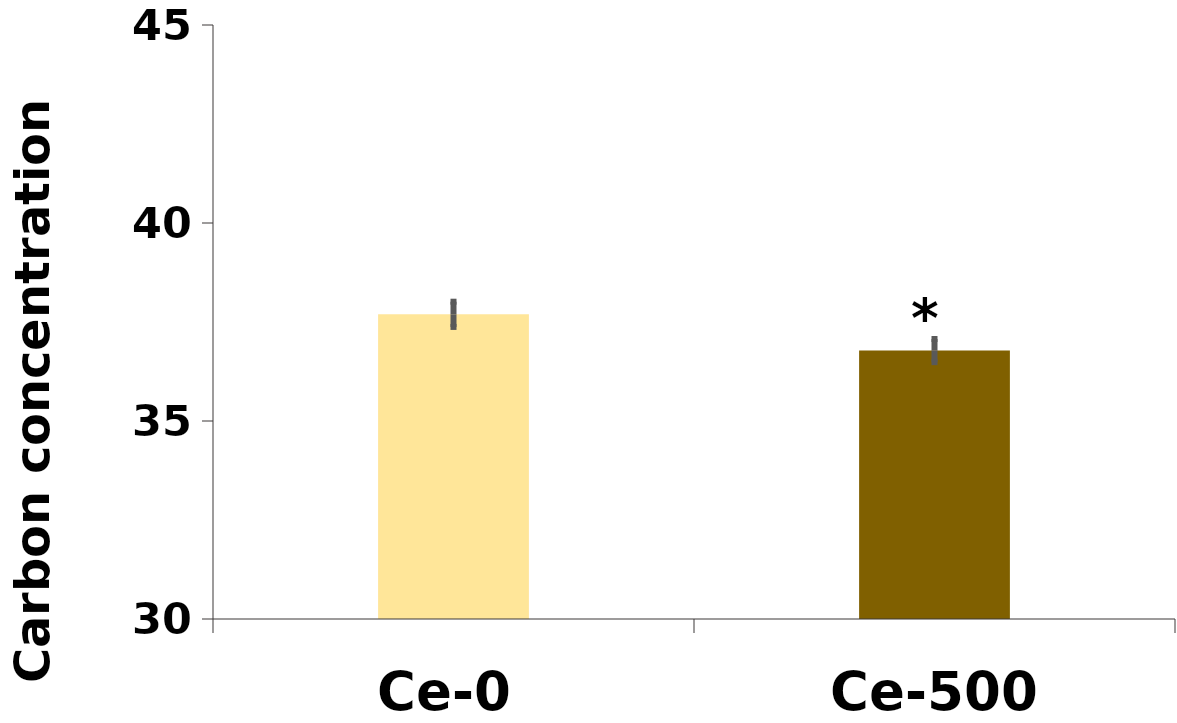
| Category | %C |
|---|---|
| Ce-0 | 37.694 |
| Ce-500 | 36.778 |